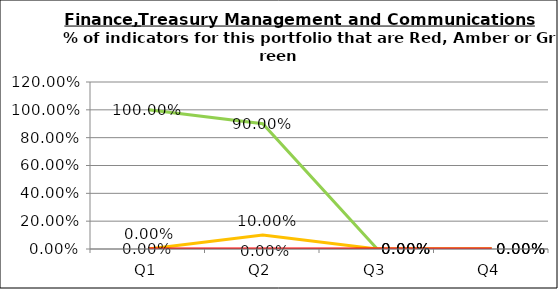
| Category | Green | Amber | Red |
|---|---|---|---|
| Q1 | 1 | 0 | 0 |
| Q2 | 0.9 | 0.1 | 0 |
| Q3 | 0 | 0 | 0 |
| Q4 | 0 | 0 | 0 |